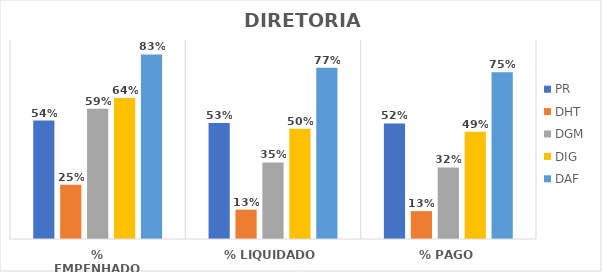
| Category | PR | DHT | DGM | DIG | DAF |
|---|---|---|---|---|---|
| % EMPENHADO | 0.536 | 0.245 | 0.589 | 0.638 | 0.835 |
| % LIQUIDADO | 0.525 | 0.133 | 0.346 | 0.499 | 0.775 |
| % PAGO | 0.523 | 0.126 | 0.324 | 0.485 | 0.755 |